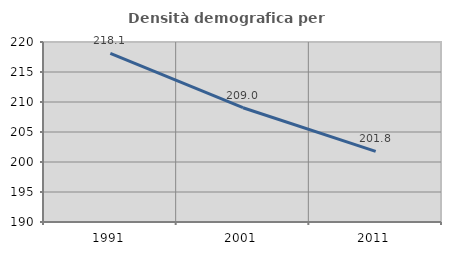
| Category | Densità demografica |
|---|---|
| 1991.0 | 218.094 |
| 2001.0 | 209.047 |
| 2011.0 | 201.763 |